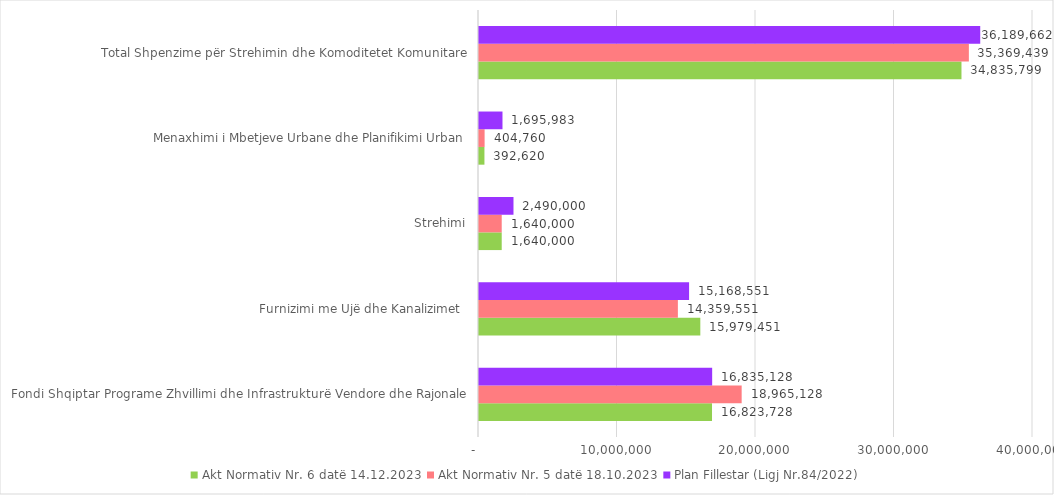
| Category | Akt Normativ Nr. 6 datë 14.12.2023 | Akt Normativ Nr. 5 datë 18.10.2023 | Plan Fillestar (Ligj Nr.84/2022) |
|---|---|---|---|
| Fondi Shqiptar Programe Zhvillimi dhe Infrastrukturë Vendore dhe Rajonale | 16823728 | 18965128 | 16835128 |
| Furnizimi me Ujë dhe Kanalizimet  | 15979451 | 14359551 | 15168551 |
| Strehimi | 1640000 | 1640000 | 2490000 |
| Menaxhimi i Mbetjeve Urbane dhe Planifikimi Urban | 392620 | 404760 | 1695983 |
| Total Shpenzime për Strehimin dhe Komoditetet Komunitare | 34835799 | 35369439 | 36189662 |